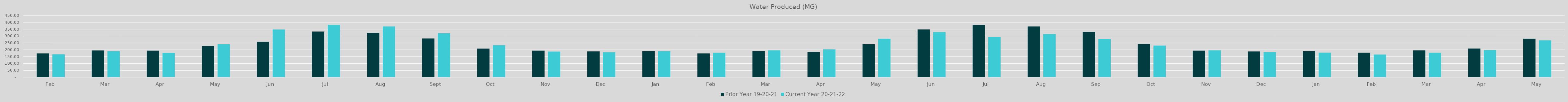
| Category | Prior Year 19-20-21 | Current Year 20-21-22 |
|---|---|---|
| Feb | 173.847 | 167.532 |
| Mar | 195.333 | 190.306 |
| Apr | 193.551 | 178.22 |
| May | 228.091 | 240.625 |
| Jun | 257.9 | 348.57 |
| Jul | 333.37 | 381.34 |
| Aug | 323.49 | 370.12 |
| Sep | 282.53 | 320.39 |
| Oct | 208.72 | 233.34 |
| Nov | 193.92 | 187.14 |
| Dec | 188.86 | 182.02 |
| Jan | 189.94 | 189.96 |
| Feb | 173.75 | 178.97 |
| Mar | 190.77 | 195.96 |
| Apr | 184.23 | 203.05 |
| May | 240.63 | 280.19 |
| Jun | 348.57 | 329.038 |
| Jul | 381.336 | 293.585 |
| Aug | 370.12 | 314.51 |
| Sep | 331.274 | 279.105 |
| Oct | 242.62 | 230.88 |
| Nov | 193.57 | 196.185 |
| Dec | 188.584 | 182.826 |
| Jan | 189.967 | 179.43 |
| Feb | 178.97 | 165.72 |
| Mar | 195.963 | 178.569 |
| Apr | 209.272 | 197.981 |
| May | 280.192 | 268.985 |